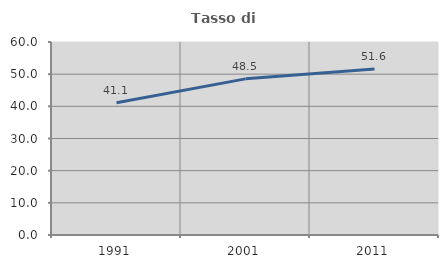
| Category | Tasso di occupazione   |
|---|---|
| 1991.0 | 41.131 |
| 2001.0 | 48.541 |
| 2011.0 | 51.628 |